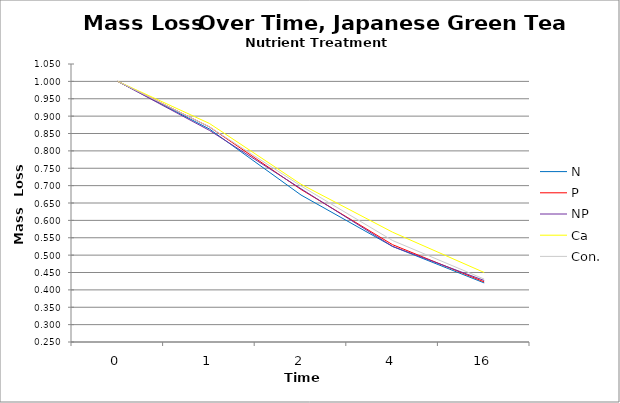
| Category | N | P | NP | Ca | Con. |
|---|---|---|---|---|---|
| 0.0 | 1 | 1 | 1 | 1 | 1 |
| 1.0 | 0.863 | 0.869 | 0.859 | 0.879 | 0.869 |
| 2.0 | 0.673 | 0.689 | 0.691 | 0.704 | 0.699 |
| 4.0 | 0.525 | 0.53 | 0.525 | 0.566 | 0.542 |
| 16.0 | 0.42 | 0.423 | 0.427 | 0.45 | 0.431 |